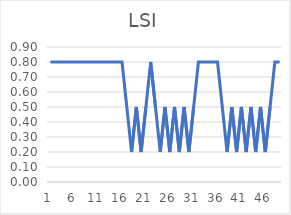
| Category | Series 0 |
|---|---|
| 0 | 0.8 |
| 1 | 0.8 |
| 2 | 0.8 |
| 3 | 0.8 |
| 4 | 0.8 |
| 5 | 0.8 |
| 6 | 0.8 |
| 7 | 0.8 |
| 8 | 0.8 |
| 9 | 0.8 |
| 10 | 0.8 |
| 11 | 0.8 |
| 12 | 0.8 |
| 13 | 0.8 |
| 14 | 0.8 |
| 15 | 0.8 |
| 16 | 0.5 |
| 17 | 0.2 |
| 18 | 0.5 |
| 19 | 0.2 |
| 20 | 0.5 |
| 21 | 0.8 |
| 22 | 0.5 |
| 23 | 0.2 |
| 24 | 0.5 |
| 25 | 0.2 |
| 26 | 0.5 |
| 27 | 0.2 |
| 28 | 0.5 |
| 29 | 0.2 |
| 30 | 0.5 |
| 31 | 0.8 |
| 32 | 0.8 |
| 33 | 0.8 |
| 34 | 0.8 |
| 35 | 0.8 |
| 36 | 0.5 |
| 37 | 0.2 |
| 38 | 0.5 |
| 39 | 0.2 |
| 40 | 0.5 |
| 41 | 0.2 |
| 42 | 0.5 |
| 43 | 0.2 |
| 44 | 0.5 |
| 45 | 0.2 |
| 46 | 0.5 |
| 47 | 0.8 |
| 48 | 0.8 |